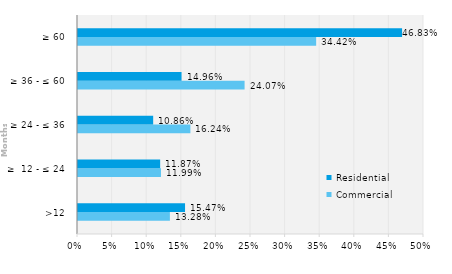
| Category | Commercial | Residential |
|---|---|---|
| >12 | 0.133 | 0.155 |
| ≥  12 - ≤ 24 | 0.12 | 0.119 |
| ≥ 24 - ≤ 36 | 0.162 | 0.109 |
| ≥ 36 - ≤ 60 | 0.241 | 0.15 |
| ≥ 60 | 0.344 | 0.468 |